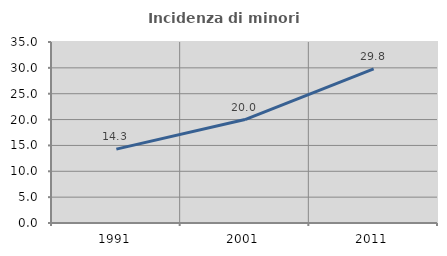
| Category | Incidenza di minori stranieri |
|---|---|
| 1991.0 | 14.286 |
| 2001.0 | 20 |
| 2011.0 | 29.797 |